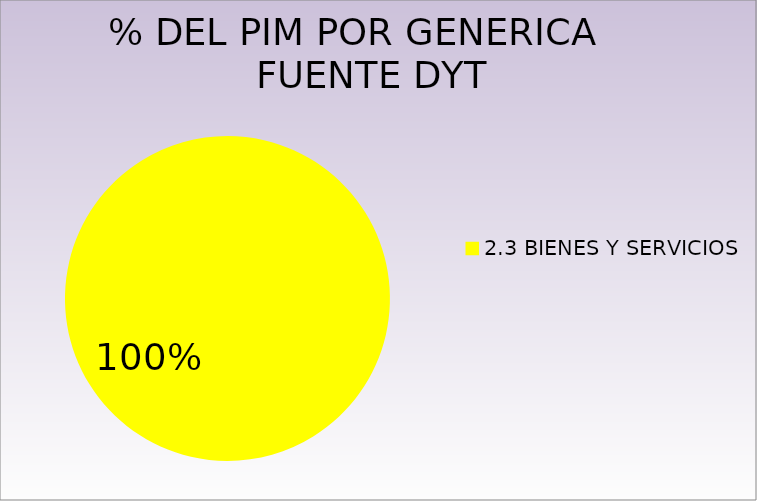
| Category | Series 0 |
|---|---|
| 2.3 BIENES Y SERVICIOS | 3819195 |